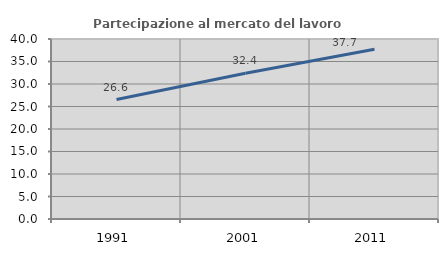
| Category | Partecipazione al mercato del lavoro  femminile |
|---|---|
| 1991.0 | 26.553 |
| 2001.0 | 32.368 |
| 2011.0 | 37.738 |